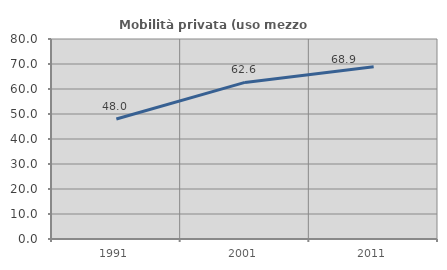
| Category | Mobilità privata (uso mezzo privato) |
|---|---|
| 1991.0 | 48.014 |
| 2001.0 | 62.638 |
| 2011.0 | 68.91 |